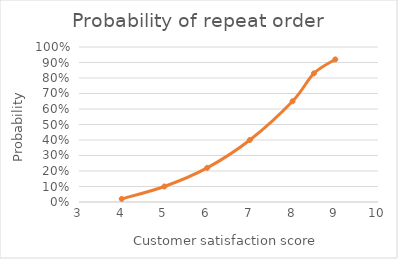
| Category | Probability of repeat order |
|---|---|
| 4.0 | 0.02 |
| 5.0 | 0.1 |
| 6.0 | 0.22 |
| 7.0 | 0.4 |
| 8.0 | 0.65 |
| 8.5 | 0.83 |
| 9.0 | 0.92 |